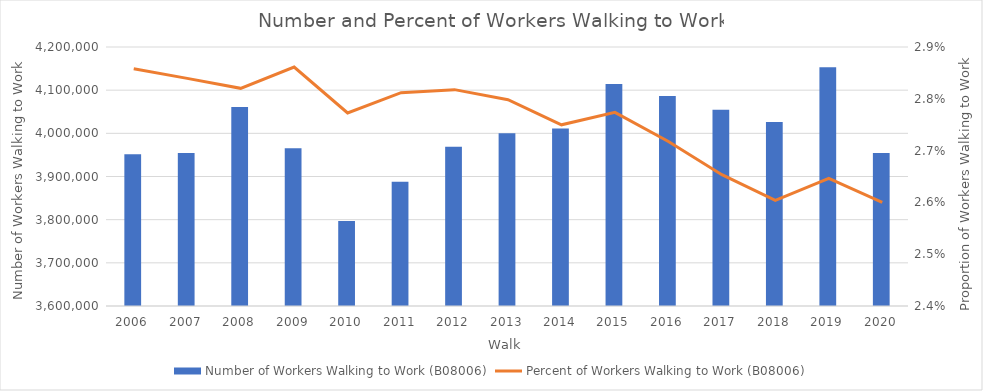
| Category | Number of Workers Walking to Work (B08006) |
|---|---|
| 2006.0 | 3951534 |
| 2007.0 | 3954210 |
| 2008.0 | 4060994 |
| 2009.0 | 3965659 |
| 2010.0 | 3797048 |
| 2011.0 | 3887969 |
| 2012.0 | 3969058 |
| 2013.0 | 4000459 |
| 2014.0 | 4011094 |
| 2015.0 | 4114125 |
| 2016.0 | 4086487 |
| 2017.0 | 4054632 |
| 2018.0 | 4026138 |
| 2019.0 | 4153050 |
| 2020.0 | 3954692 |